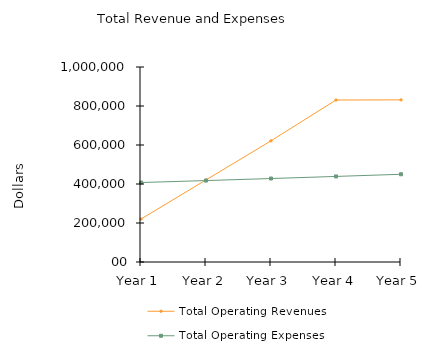
| Category | Total Operating Revenues | Total Operating Expenses |
|---|---|---|
| 1.0 | 220375 | 407500 |
| 2.0 | 420881.25 | 417625 |
| 3.0 | 621402.688 | 428053.75 |
| 4.0 | 830715.675 | 438795.362 |
| 5.0 | 831490.146 | 449859.223 |